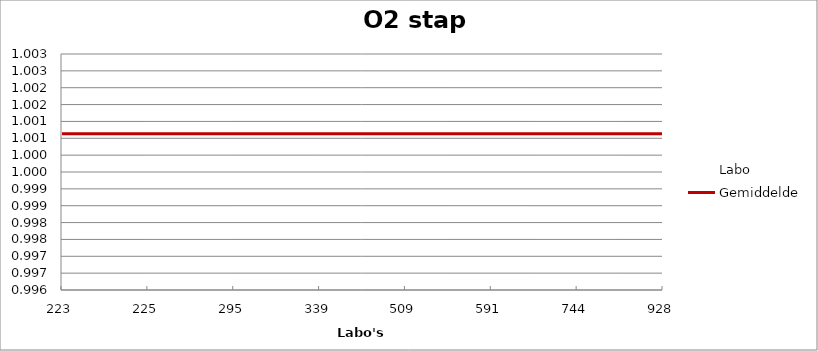
| Category | Labo | Gemiddelde |
|---|---|---|
| 223.0 | 1 | 1.001 |
| 225.0 | 1.001 | 1.001 |
| 295.0 | 1.002 | 1.001 |
| 339.0 | 1.001 | 1.001 |
| 509.0 | 0.999 | 1.001 |
| 591.0 | 1.002 | 1.001 |
| 744.0 | 1 | 1.001 |
| 928.0 | 0.997 | 1.001 |